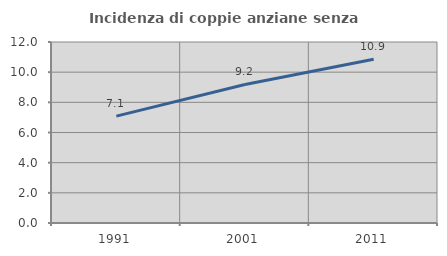
| Category | Incidenza di coppie anziane senza figli  |
|---|---|
| 1991.0 | 7.086 |
| 2001.0 | 9.184 |
| 2011.0 | 10.86 |